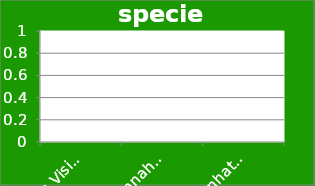
| Category | species |
|---|---|
| 0's Vision | 0 |
| Mannahatta (1609) | 0 |
| Manhattan (2010) | 0 |